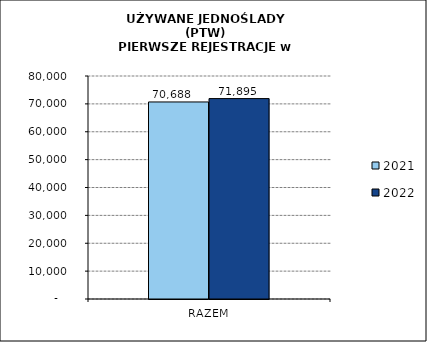
| Category | 2021 | 2022 |
|---|---|---|
| RAZEM | 70688 | 71895 |